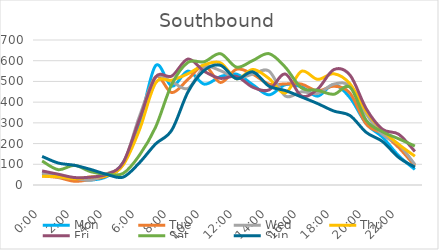
| Category | Mon | Tue | Wed | Thu | Fri | Sat | Sun |
|---|---|---|---|---|---|---|---|
| 0.0 | 56 | 44 | 58 | 42 | 68 | 116 | 138 |
| 0.041667 | 46 | 36 | 38 | 40 | 52 | 74 | 106 |
| 0.083333 | 30 | 18 | 33 | 30 | 36 | 95 | 95 |
| 0.125 | 24 | 27 | 23 | 39 | 38 | 64 | 75 |
| 0.166667 | 41 | 45 | 55 | 45 | 52 | 52 | 51 |
| 0.208333 | 108 | 101 | 102 | 97 | 109 | 56 | 38 |
| 0.25 | 293 | 318 | 330 | 265 | 315 | 143 | 107 |
| 0.291667 | 576 | 522 | 519 | 492 | 521 | 279 | 198 |
| 0.333333 | 477 | 446 | 498 | 506 | 526 | 486 | 265 |
| 0.375 | 550 | 510 | 466 | 537 | 608 | 592 | 449 |
| 0.416667 | 487 | 577 | 568 | 580 | 549 | 595 | 553 |
| 0.458333 | 523 | 495 | 552 | 590 | 515 | 634 | 578 |
| 0.5 | 535 | 559 | 516 | 513 | 524 | 569 | 513 |
| 0.541667 | 484 | 535 | 535 | 558 | 472 | 601 | 546 |
| 0.5833333333333334 | 435 | 487 | 550 | 514 | 459 | 634 | 477 |
| 0.625 | 484 | 488 | 430 | 444 | 536 | 569 | 456 |
| 0.666667 | 474 | 487 | 450 | 549 | 430 | 469 | 425 |
| 0.708333 | 429 | 454 | 442 | 510 | 463 | 457 | 393 |
| 0.75 | 485 | 477 | 487 | 537 | 557 | 438 | 357 |
| 0.791667 | 421 | 443 | 477 | 488 | 530 | 472 | 335 |
| 0.833333 | 295 | 294 | 342 | 355 | 368 | 312 | 254 |
| 0.875 | 231 | 248 | 244 | 263 | 269 | 257 | 210 |
| 0.916667 | 141 | 181 | 196 | 196 | 245 | 223 | 133 |
| 0.958333 | 75 | 92 | 99 | 139 | 162 | 188 | 86 |